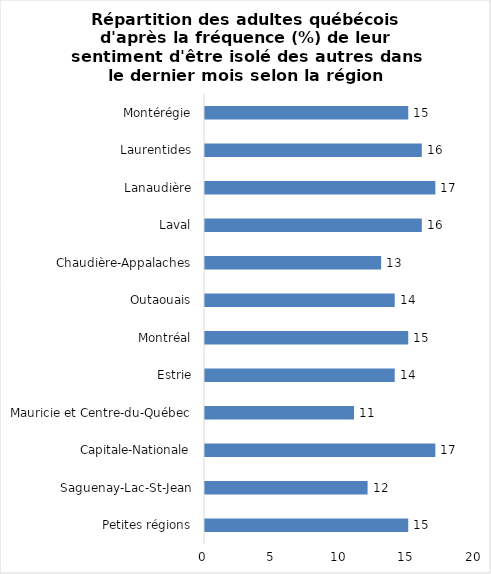
| Category | Series 0 |
|---|---|
| Petites régions | 15 |
| Saguenay-Lac-St-Jean | 12 |
| Capitale-Nationale | 17 |
| Mauricie et Centre-du-Québec | 11 |
| Estrie | 14 |
| Montréal | 15 |
| Outaouais | 14 |
| Chaudière-Appalaches | 13 |
| Laval | 16 |
| Lanaudière | 17 |
| Laurentides | 16 |
| Montérégie | 15 |